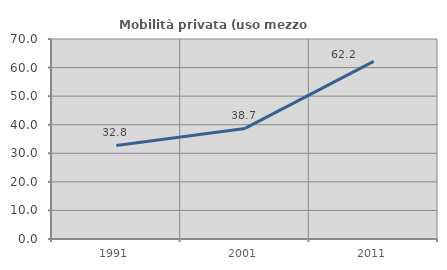
| Category | Mobilità privata (uso mezzo privato) |
|---|---|
| 1991.0 | 32.759 |
| 2001.0 | 38.71 |
| 2011.0 | 62.162 |